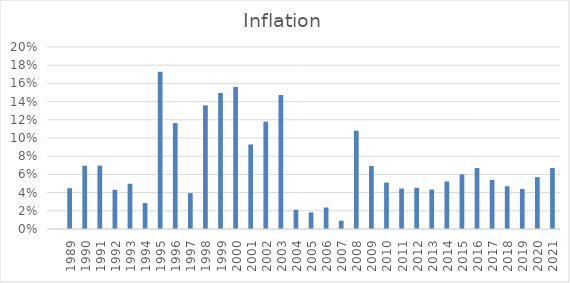
| Category | Series 0 |
|---|---|
| nan | 0 |
| 1989.0 | 0.045 |
| 1990.0 | 0.07 |
| 1991.0 | 0.07 |
| 1992.0 | 0.043 |
| 1993.0 | 0.05 |
| 1994.0 | 0.029 |
| 1995.0 | 0.173 |
| 1996.0 | 0.116 |
| 1997.0 | 0.039 |
| 1998.0 | 0.136 |
| 1999.0 | 0.149 |
| 2000.0 | 0.156 |
| 2001.0 | 0.093 |
| 2002.0 | 0.118 |
| 2003.0 | 0.147 |
| 2004.0 | 0.021 |
| 2005.0 | 0.018 |
| 2006.0 | 0.024 |
| 2007.0 | 0.009 |
| 2008.0 | 0.108 |
| 2009.0 | 0.069 |
| 2010.0 | 0.051 |
| 2011.0 | 0.044 |
| 2012.0 | 0.045 |
| 2013.0 | 0.043 |
| 2014.0 | 0.052 |
| 2015.0 | 0.06 |
| 2016.0 | 0.067 |
| 2017.0 | 0.054 |
| 2018.0 | 0.047 |
| 2019.0 | 0.044 |
| 2020.0 | 0.057 |
| 2021.0 | 0.067 |